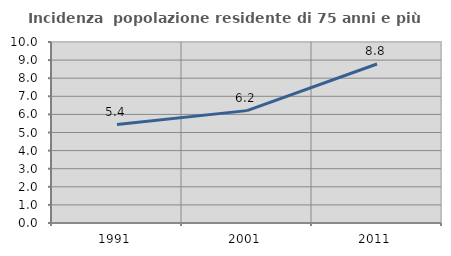
| Category | Incidenza  popolazione residente di 75 anni e più |
|---|---|
| 1991.0 | 5.441 |
| 2001.0 | 6.209 |
| 2011.0 | 8.786 |